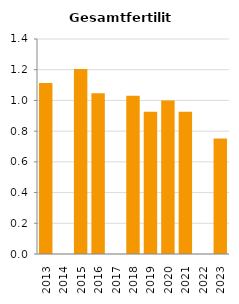
| Category | Gesamtfertilität |
|---|---|
| 2013.0 | 1.113 |
| 2014.0 | 0 |
| 2015.0 | 1.205 |
| 2016.0 | 1.047 |
| 2017.0 | 0 |
| 2018.0 | 1.03 |
| 2019.0 | 0.926 |
| 2020.0 | 1 |
| 2021.0 | 0.926 |
| 2022.0 | 0 |
| 2023.0 | 0.753 |